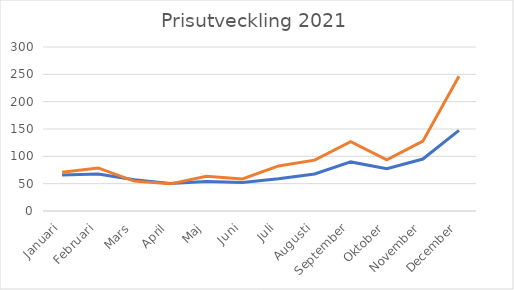
| Category | Series 0 | Series 1 |
|---|---|---|
| Januari | 65.95 | 70.71 |
| Februari | 67.83 | 78.74 |
| Mars | 57.09 | 54.65 |
| April | 50.33 | 49.67 |
| Maj | 53.94 | 63.34 |
| Juni | 52.19 | 58.74 |
| Juli | 59.06 | 82.41 |
| Augusti | 67.8 | 93.07 |
| September | 89.8 | 126.65 |
| Oktober | 77.43 | 93.65 |
| November | 95.05 | 127.83 |
| December | 147.56 | 246.5 |